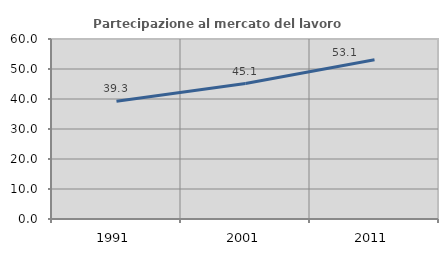
| Category | Partecipazione al mercato del lavoro  femminile |
|---|---|
| 1991.0 | 39.277 |
| 2001.0 | 45.14 |
| 2011.0 | 53.071 |